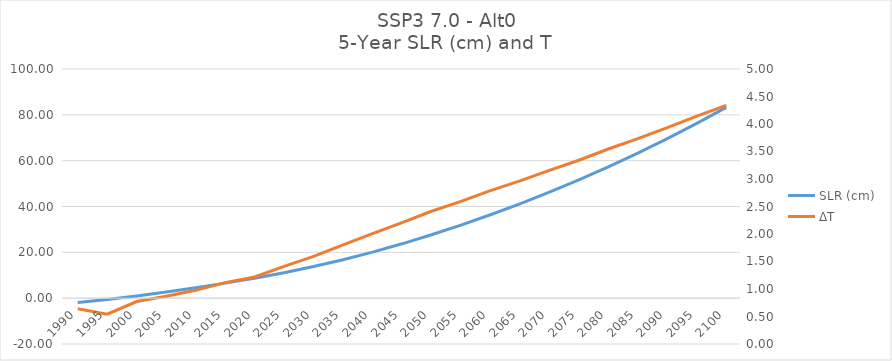
| Category | SLR (cm) |
|---|---|
| 1990.0 | -1.853 |
| 1995.0 | -0.626 |
| 2000.0 | 0.958 |
| 2005.0 | 2.678 |
| 2010.0 | 4.531 |
| 2015.0 | 6.565 |
| 2020.0 | 8.703 |
| 2025.0 | 11.118 |
| 2030.0 | 13.794 |
| 2035.0 | 16.789 |
| 2040.0 | 20.098 |
| 2045.0 | 23.716 |
| 2050.0 | 27.658 |
| 2055.0 | 31.87 |
| 2060.0 | 36.386 |
| 2065.0 | 41.168 |
| 2070.0 | 46.249 |
| 2075.0 | 51.612 |
| 2080.0 | 57.305 |
| 2085.0 | 63.296 |
| 2090.0 | 69.61 |
| 2095.0 | 76.268 |
| 2100.0 | 83.244 |